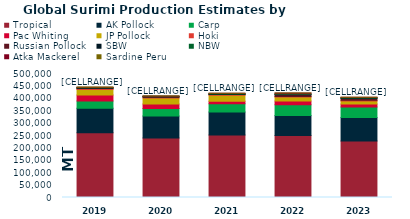
| Category | Tropical | AK Pollock | Carp | Pac Whiting | JP Pollock | Hoki | Russian Pollock | SBW | NBW | Atka Mackerel | Sardine Peru |
|---|---|---|---|---|---|---|---|---|---|---|---|
| 2019.0 | 260713.987 | 99665 | 28364.172 | 24988.578 | 21982.093 | 4163.6 | 259.021 | 1956.4 | 1934.376 | 406.59 | 648 |
| 2020.0 | 240308.276 | 88158 | 30299.388 | 18648.142 | 24231.363 | 3408.6 | 96.389 | 1799.4 | 1305.141 | 552.406 | 442 |
| 2021.0 | 252445.733 | 91837 | 33773.732 | 10458.125 | 23866.714 | 2824 | 453.851 | 1894 | 2095.279 | 578.782 | 383 |
| 2022.0 | 250228.442 | 80402 | 43064.779 | 15622.968 | 15630.089 | 2636.4 | 6350.652 | 1742.6 | 2206.029 | 3067.428 | 192 |
| 2023.0 | 227322.804 | 95752 | 41896.905 | 12233.329 | 11435.661 | 3555.6 | 6971.978 | 1600.4 | 2110.841 | 1172.378 | 264 |